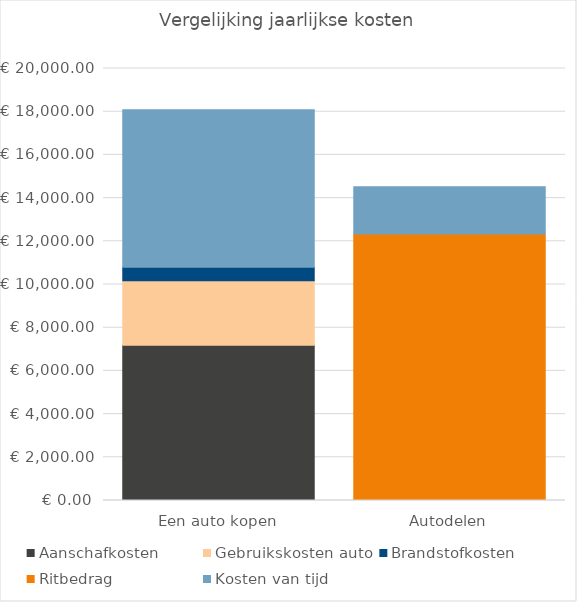
| Category | Aanschafkosten | Gebruikskosten auto | Brandstofkosten | Ritbedrag | Kosten van tijd |
|---|---|---|---|---|---|
| Een auto kopen | 7187.315 | 2990 | 617.692 | 0 | 7300 |
| Autodelen | 0 | 0 | 0 | 12340.65 | 2190 |